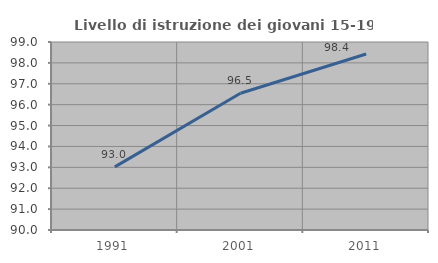
| Category | Livello di istruzione dei giovani 15-19 anni |
|---|---|
| 1991.0 | 93.022 |
| 2001.0 | 96.549 |
| 2011.0 | 98.425 |